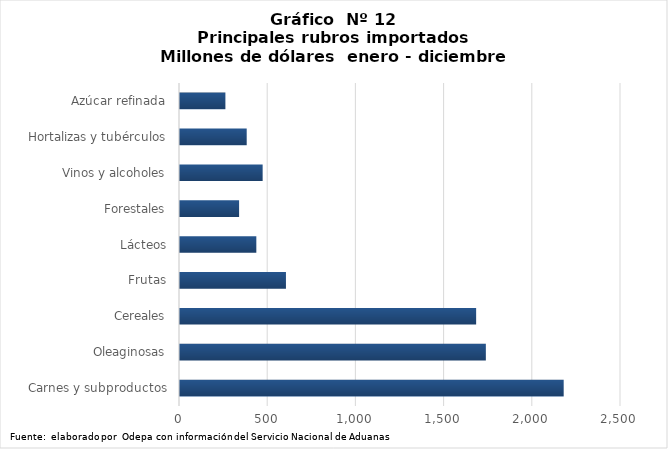
| Category | Series 0 |
|---|---|
| Carnes y subproductos | 2175086.345 |
| Oleaginosas | 1733852.088 |
| Cereales | 1678809.407 |
| Frutas | 600603.683 |
| Lácteos | 432710.88 |
| Forestales | 335036 |
| Vinos y alcoholes | 468510.649 |
| Hortalizas y tubérculos | 378157.252 |
| Azúcar refinada | 257373.792 |